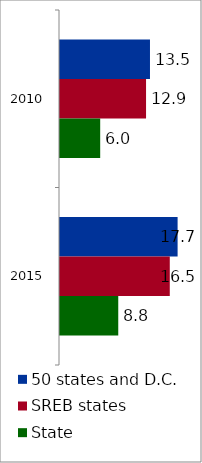
| Category | 50 states and D.C. | SREB states | State |
|---|---|---|---|
| 2010.0 | 13.531 | 12.94 | 6.044 |
| 2015.0 | 17.684 | 16.508 | 8.76 |